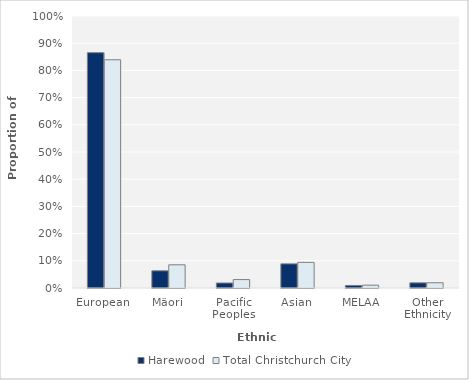
| Category | Harewood | Total Christchurch City |
|---|---|---|
| European | 0.865 | 0.839 |
| Mäori | 0.063 | 0.085 |
| Pacific Peoples | 0.018 | 0.031 |
| Asian | 0.089 | 0.094 |
| MELAA | 0.009 | 0.01 |
| Other Ethnicity | 0.019 | 0.019 |